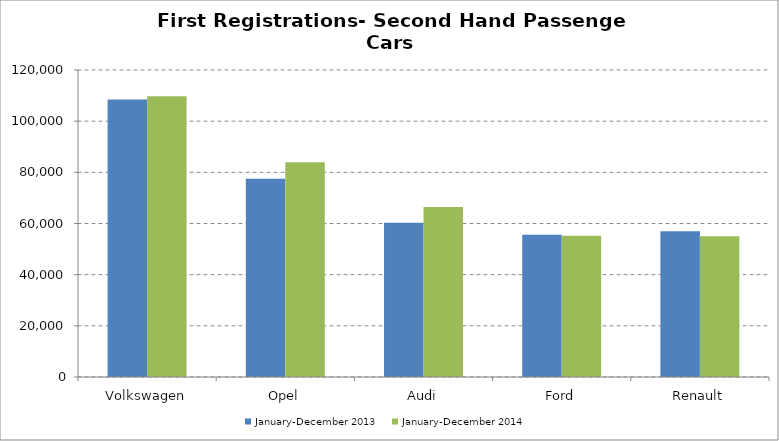
| Category | January-December 2013 | January-December 2014 |
|---|---|---|
| Volkswagen | 108436 | 109761 |
| Opel | 77447 | 83929 |
| Audi | 60338 | 66462 |
| Ford | 55578 | 55217 |
| Renault | 56956 | 55035 |